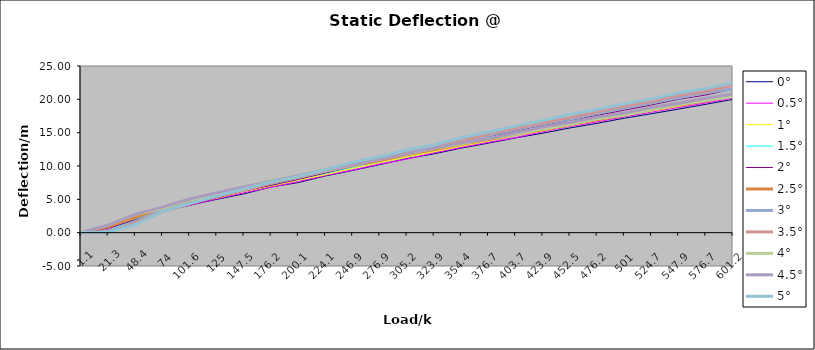
| Category | 0° | 0.5° | 1° | 1.5° | 2° | 2.5° | 3° | 3.5° | 4° | 4.5° | 5° |
|---|---|---|---|---|---|---|---|---|---|---|---|
| 1.1 | 0.01 | 0.02 | 0 | 0 | 0 | 0.04 | -0.01 | 0.03 | 0 | 0 | 0.01 |
| 21.3 | 0.19 | 0.42 | 0.31 | 0.3 | 0.67 | 0.91 | 0.1 | 0.05 | 1.13 | 1.14 | 0.06 |
| 48.4 | 1.68 | 2.01 | 2.02 | 2.05 | 1.93 | 2.29 | 1.66 | 1.45 | 2.71 | 2.76 | 1.22 |
| 74.0 | 3.09 | 3.27 | 3.21 | 3.31 | 3.18 | 3.65 | 3.37 | 3.11 | 3.65 | 3.83 | 3.17 |
| 101.6 | 4.14 | 4.09 | 4.48 | 4.58 | 4.11 | 4.64 | 4.43 | 4.34 | 4.91 | 5.04 | 4.36 |
| 125.0 | 5 | 5.08 | 5.17 | 5.41 | 5.24 | 5.65 | 5.6 | 5.45 | 5.69 | 5.98 | 5.5 |
| 147.5 | 5.83 | 5.99 | 6.18 | 6.37 | 6.24 | 6.56 | 6.39 | 6.38 | 6.85 | 6.87 | 6.54 |
| 176.2 | 6.85 | 6.82 | 6.99 | 7.24 | 7.09 | 7.5 | 7.44 | 7.44 | 7.84 | 7.72 | 7.61 |
| 200.1 | 7.52 | 7.66 | 7.88 | 8.1 | 7.99 | 8.31 | 8.32 | 8.35 | 8.55 | 8.53 | 8.41 |
| 224.1 | 8.51 | 8.58 | 8.68 | 8.91 | 8.96 | 9.23 | 9.23 | 9.26 | 9.43 | 9.41 | 9.44 |
| 246.9 | 9.33 | 9.39 | 9.66 | 9.84 | 9.94 | 10.11 | 10.06 | 10.1 | 10.21 | 10.26 | 10.58 |
| 276.9 | 10.22 | 10.29 | 10.53 | 10.77 | 10.76 | 10.83 | 11.03 | 11.11 | 11.04 | 10.98 | 11.41 |
| 305.2 | 11.11 | 11.04 | 11.36 | 11.64 | 11.81 | 11.69 | 11.93 | 11.98 | 11.78 | 11.87 | 12.41 |
| 323.9 | 11.83 | 11.98 | 12.14 | 12.41 | 12.67 | 12.46 | 12.9 | 12.92 | 12.65 | 12.7 | 13.16 |
| 354.4 | 12.69 | 12.78 | 12.98 | 13.25 | 13.59 | 13.26 | 13.74 | 13.72 | 13.35 | 13.47 | 14.25 |
| 376.7 | 13.43 | 13.54 | 13.75 | 14.21 | 14.34 | 13.96 | 14.62 | 14.83 | 14.12 | 14.08 | 15.1 |
| 403.7 | 14.22 | 14.25 | 14.61 | 14.95 | 15.28 | 14.75 | 15.47 | 15.67 | 14.8 | 14.97 | 15.98 |
| 423.9 | 14.92 | 15.14 | 15.28 | 15.58 | 16.04 | 15.49 | 16.33 | 16.49 | 15.56 | 15.86 | 16.82 |
| 452.5 | 15.71 | 15.95 | 16.05 | 16.4 | 16.86 | 16.25 | 17.01 | 17.26 | 16.26 | 16.53 | 17.73 |
| 476.2 | 16.4 | 16.61 | 16.83 | 17.28 | 17.58 | 16.94 | 17.89 | 18.15 | 17.07 | 17.33 | 18.48 |
| 501.0 | 17.17 | 17.39 | 17.57 | 17.91 | 18.38 | 17.66 | 18.73 | 19 | 17.65 | 17.95 | 19.32 |
| 524.7 | 17.84 | 18.08 | 18.24 | 18.68 | 19.16 | 18.43 | 19.5 | 19.71 | 18.45 | 18.76 | 20.05 |
| 547.9 | 18.54 | 18.78 | 18.94 | 19.3 | 20 | 19.15 | 20.23 | 20.57 | 19.22 | 19.42 | 20.94 |
| 576.7 | 19.26 | 19.45 | 19.73 | 20.06 | 20.65 | 19.79 | 21.02 | 21.2 | 19.87 | 20.15 | 21.61 |
| 601.2 | 19.99 | 20.18 | 20.38 | 20.72 | 21.53 | 20.52 | 21.53 | 22.11 | 20.42 | 20.78 | 22.47 |